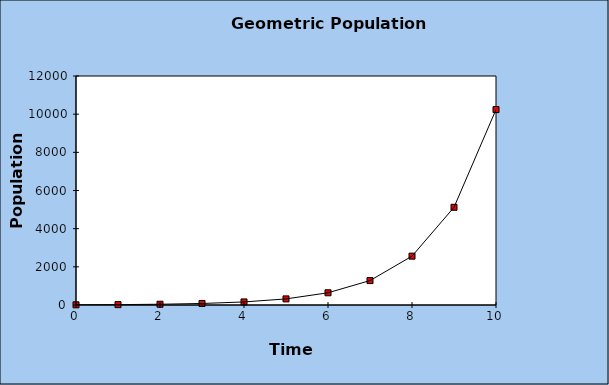
| Category | Series 0 |
|---|---|
| 0.0 | 10 |
| 1.0 | 20 |
| 2.0 | 40 |
| 3.0 | 80 |
| 4.0 | 160 |
| 5.0 | 320 |
| 6.0 | 640 |
| 7.0 | 1280 |
| 8.0 | 2560 |
| 9.0 | 5120 |
| 10.0 | 10240 |